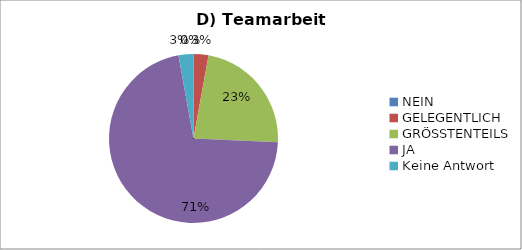
| Category | Series 0 |
|---|---|
| NEIN | 0 |
| GELEGENTLICH | 1 |
| GRÖSSTENTEILS | 8 |
| JA | 25 |
| Keine Antwort | 1 |